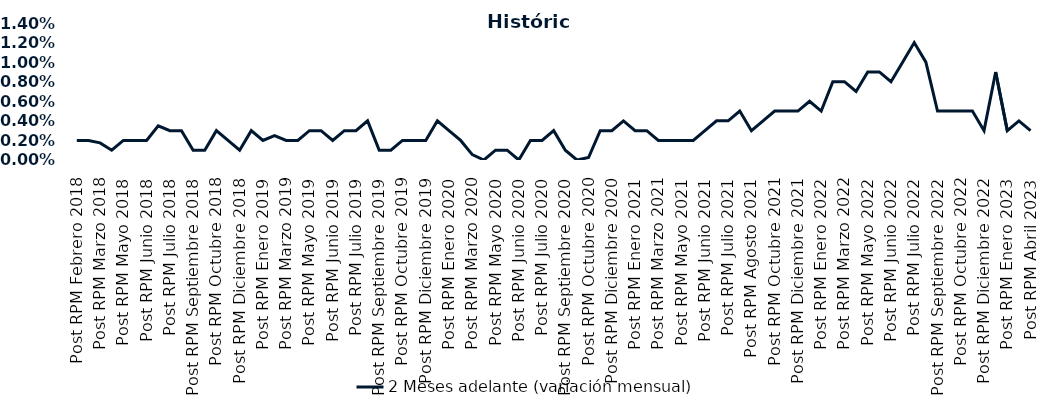
| Category | 2 Meses adelante (variación mensual) |
|---|---|
| Post RPM Febrero 2018 | 0.002 |
| Pre RPM Marzo 2018 | 0.002 |
| Post RPM Marzo 2018 | 0.002 |
| Pre RPM Mayo 2018 | 0.001 |
| Post RPM Mayo 2018 | 0.002 |
| Pre RPM Junio 2018 | 0.002 |
| Post RPM Junio 2018 | 0.002 |
| Pre RPM Julio 2018 | 0.004 |
| Post RPM Julio 2018 | 0.003 |
| Pre RPM Septiembre 2018 | 0.003 |
| Post RPM Septiembre 2018 | 0.001 |
| Pre RPM Octubre 2018 | 0.001 |
| Post RPM Octubre 2018 | 0.003 |
| Pre RPM Diciembre 2018 | 0.002 |
| Post RPM Diciembre 2018 | 0.001 |
| Pre RPM Enero 2019 | 0.003 |
| Post RPM Enero 2019 | 0.002 |
| Pre RPM Marzo 2019 | 0.002 |
| Post RPM Marzo 2019 | 0.002 |
| Pre RPM Mayo 2019 | 0.002 |
| Post RPM Mayo 2019 | 0.003 |
| Pre RPM Junio 2019 | 0.003 |
| Post RPM Junio 2019 | 0.002 |
| Pre RPM Julio 2019 | 0.003 |
| Post RPM Julio 2019 | 0.003 |
| Pre RPM Septiembre 2019 | 0.004 |
| Post RPM Septiembre 2019 | 0.001 |
| Pre RPM Octubre 2019 | 0.001 |
| Post RPM Octubre 2019 | 0.002 |
| Pre RPM Diciembre 2019 | 0.002 |
| Post RPM Diciembre 2019 | 0.002 |
| Pre RPM Enero 2020 | 0.004 |
| Post RPM Enero 2020 | 0.003 |
| Pre RPM Marzo 2020 | 0.002 |
| Post RPM Marzo 2020 | 0.001 |
| Pre RPM Mayo 2020 | 0 |
| Post RPM Mayo 2020 | 0.001 |
| Pre RPM Junio 2020 | 0.001 |
| Post RPM Junio 2020 | 0 |
| Pre RPM Julio 2020 | 0.002 |
| Post RPM Julio 2020 | 0.002 |
| Pre RPM Septiembre 2020 | 0.003 |
| Post RPM Septiembre 2020 | 0.001 |
| Pre RPM Octubre 2020 | 0 |
| Post RPM Octubre 2020 | 0 |
| Pre RPM Diciembre 2020 | 0.003 |
| Post RPM Diciembre 2020 | 0.003 |
| Pre RPM Enero 2021 | 0.004 |
| Post RPM Enero 2021 | 0.003 |
| Pre RPM Marzo 2021 | 0.003 |
| Post RPM Marzo 2021 | 0.002 |
| Pre RPM Mayo 2021 | 0.002 |
| Post RPM Mayo 2021 | 0.002 |
| Pre RPM Junio 2021 | 0.002 |
| Post RPM Junio 2021 | 0.003 |
| Pre RPM Julio 2021 | 0.004 |
| Post RPM Julio 2021 | 0.004 |
| Pre RPM Agosto 2021 | 0.005 |
| Post RPM Agosto 2021 | 0.003 |
| Pre RPM Octubre 2021 | 0.004 |
| Post RPM Octubre 2021 | 0.005 |
| Pre RPM Diciembre 2021 | 0.005 |
| Post RPM Diciembre 2021 | 0.005 |
| Pre RPM Enero 2022 | 0.006 |
| Post RPM Enero 2022 | 0.005 |
| Pre RPM Marzo 2022 | 0.008 |
| Post RPM Marzo 2022 | 0.008 |
| Pre RPM Mayo 2022 | 0.007 |
| Post RPM Mayo 2022 | 0.009 |
| Pre RPM Junio 2022 | 0.009 |
| Post RPM Junio 2022 | 0.008 |
| Pre RPM Julio 2022 | 0.01 |
| Post RPM Julio 2022 | 0.012 |
| Pre RPM Septiembre 2022 | 0.01 |
| Post RPM Septiembre 2022 | 0.005 |
| Pre RPM Octubre 2022 | 0.005 |
| Post RPM Octubre 2022 | 0.005 |
| Pre RPM Diciembre 2022 | 0.005 |
| Post RPM Diciembre 2022 | 0.003 |
| Pre RPM Enero 2023 | 0.009 |
| Post RPM Enero 2023 | 0.003 |
| Pre RPM Abril 2023 | 0.004 |
| Post RPM Abril 2023 | 0.003 |